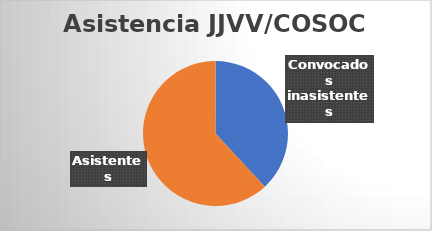
| Category | Series 0 |
|---|---|
| Convocados inasistentes | 8 |
| Asistentes | 13 |